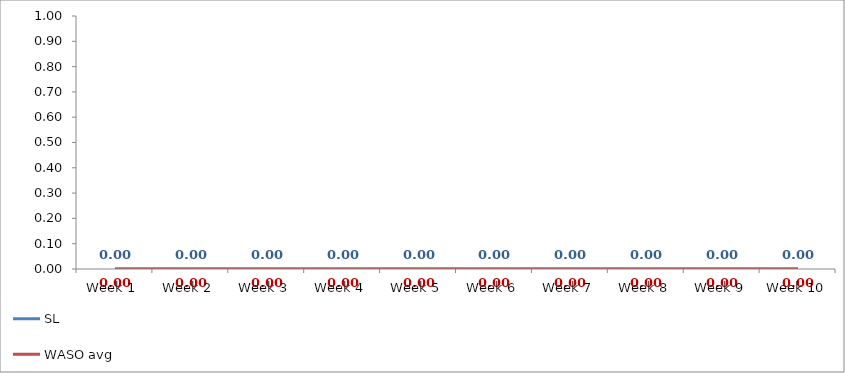
| Category | SL | WASO avg |
|---|---|---|
| Week 1 | 0 | 0 |
| Week 2 | 0 | 0 |
| Week 3 | 0 | 0 |
| Week 4 | 0 | 0 |
| Week 5 | 0 | 0 |
| Week 6 | 0 | 0 |
| Week 7 | 0 | 0 |
| Week 8 | 0 | 0 |
| Week 9 | 0 | 0 |
| Week 10 | 0 | 0 |